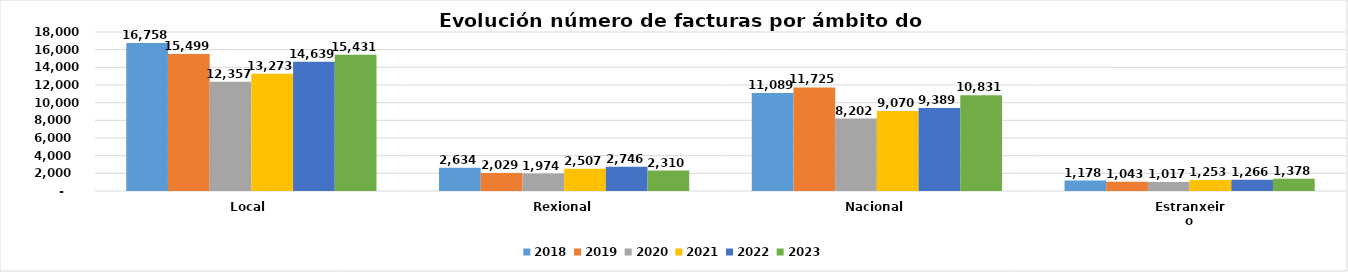
| Category | 2018 | 2019 | 2020 | 2021 | 2022 | 2023 |
|---|---|---|---|---|---|---|
| Local  | 16758 | 15499 | 12357 | 13273 | 14639 | 15431 |
| Rexional | 2634 | 2029 | 1974 | 2507 | 2746 | 2310 |
| Nacional | 11089 | 11725 | 8202 | 9070 | 9389 | 10831 |
| Estranxeiro | 1178 | 1043 | 1017 | 1253 | 1266 | 1378 |